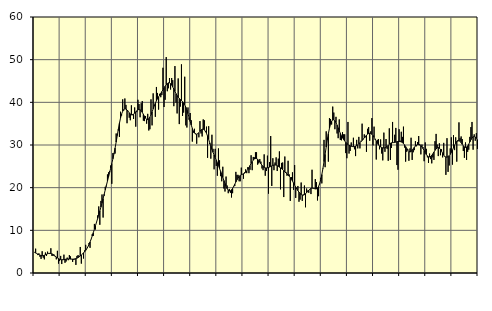
| Category | Piggar | Series 1 |
|---|---|---|
| nan | 4.8 | 4.87 |
| 87.0 | 5.7 | 4.69 |
| 87.0 | 4.6 | 4.56 |
| 87.0 | 4.2 | 4.43 |
| 87.0 | 4.6 | 4.31 |
| 87.0 | 3.8 | 4.19 |
| 87.0 | 3.3 | 4.1 |
| 87.0 | 5.1 | 4.07 |
| 87.0 | 3.6 | 4.08 |
| 87.0 | 3.2 | 4.16 |
| 87.0 | 4.8 | 4.27 |
| 87.0 | 4 | 4.39 |
| nan | 5 | 4.5 |
| 88.0 | 4.6 | 4.58 |
| 88.0 | 4.5 | 4.61 |
| 88.0 | 5.8 | 4.58 |
| 88.0 | 4 | 4.49 |
| 88.0 | 4 | 4.34 |
| 88.0 | 4.3 | 4.15 |
| 88.0 | 3.8 | 3.95 |
| 88.0 | 3.2 | 3.74 |
| 88.0 | 5.2 | 3.54 |
| 88.0 | 2.2 | 3.37 |
| 88.0 | 2.8 | 3.24 |
| nan | 4 | 3.15 |
| 89.0 | 2.1 | 3.11 |
| 89.0 | 3.2 | 3.1 |
| 89.0 | 4.3 | 3.14 |
| 89.0 | 2.4 | 3.19 |
| 89.0 | 2.7 | 3.25 |
| 89.0 | 3.6 | 3.29 |
| 89.0 | 3 | 3.3 |
| 89.0 | 4.2 | 3.29 |
| 89.0 | 3.9 | 3.26 |
| 89.0 | 3.3 | 3.25 |
| 89.0 | 2.6 | 3.25 |
| nan | 3.1 | 3.27 |
| 90.0 | 3.2 | 3.31 |
| 90.0 | 1.9 | 3.38 |
| 90.0 | 4 | 3.48 |
| 90.0 | 4.2 | 3.61 |
| 90.0 | 4 | 3.78 |
| 90.0 | 6.1 | 3.99 |
| 90.0 | 2.2 | 4.22 |
| 90.0 | 4.5 | 4.45 |
| 90.0 | 3.4 | 4.7 |
| 90.0 | 5.3 | 4.98 |
| 90.0 | 6.6 | 5.3 |
| nan | 5.7 | 5.67 |
| 91.0 | 6.1 | 6.12 |
| 91.0 | 7 | 6.66 |
| 91.0 | 5.9 | 7.26 |
| 91.0 | 7.9 | 7.93 |
| 91.0 | 9.1 | 8.67 |
| 91.0 | 8.7 | 9.45 |
| 91.0 | 11.5 | 10.26 |
| 91.0 | 10.2 | 11.1 |
| 91.0 | 11.9 | 11.94 |
| 91.0 | 13.5 | 12.78 |
| 91.0 | 15.6 | 13.63 |
| nan | 11.3 | 14.51 |
| 92.0 | 16.9 | 15.45 |
| 92.0 | 18.4 | 16.42 |
| 92.0 | 13 | 17.44 |
| 92.0 | 18.1 | 18.47 |
| 92.0 | 20.2 | 19.5 |
| 92.0 | 20.3 | 20.52 |
| 92.0 | 23.1 | 21.53 |
| 92.0 | 23.6 | 22.55 |
| 92.0 | 23.9 | 23.57 |
| 92.0 | 25.2 | 24.59 |
| 92.0 | 20.9 | 25.65 |
| nan | 28.1 | 26.76 |
| 93.0 | 28.1 | 27.96 |
| 93.0 | 28 | 29.27 |
| 93.0 | 32.7 | 30.69 |
| 93.0 | 32.5 | 32.2 |
| 93.0 | 33.4 | 33.71 |
| 93.0 | 31.9 | 35.1 |
| 93.0 | 37.8 | 36.3 |
| 93.0 | 36.9 | 37.25 |
| 93.0 | 40.7 | 37.91 |
| 93.0 | 38.1 | 38.31 |
| 93.0 | 40.9 | 38.48 |
| nan | 39.4 | 38.43 |
| 94.0 | 35.1 | 38.21 |
| 94.0 | 38 | 37.89 |
| 94.0 | 36.4 | 37.55 |
| 94.0 | 35.8 | 37.24 |
| 94.0 | 39.3 | 37.07 |
| 94.0 | 37.2 | 37.06 |
| 94.0 | 36.1 | 37.21 |
| 94.0 | 38.8 | 37.47 |
| 94.0 | 34.3 | 37.77 |
| 94.0 | 37.7 | 38.04 |
| 94.0 | 40.6 | 38.25 |
| nan | 39.6 | 38.32 |
| 95.0 | 36.5 | 38.25 |
| 95.0 | 39.8 | 38.02 |
| 95.0 | 40.3 | 37.65 |
| 95.0 | 35.7 | 37.2 |
| 95.0 | 35.6 | 36.73 |
| 95.0 | 36.8 | 36.3 |
| 95.0 | 35 | 36.02 |
| 95.0 | 37.3 | 35.95 |
| 95.0 | 33.4 | 36.13 |
| 95.0 | 33.7 | 36.54 |
| 95.0 | 40.7 | 37.09 |
| nan | 34.6 | 37.75 |
| 96.0 | 42.1 | 38.47 |
| 96.0 | 39.4 | 39.17 |
| 96.0 | 36.6 | 39.8 |
| 96.0 | 43.6 | 40.36 |
| 96.0 | 42.2 | 40.85 |
| 96.0 | 38.3 | 41.29 |
| 96.0 | 42 | 41.7 |
| 96.0 | 41.2 | 42.09 |
| 96.0 | 41.7 | 42.51 |
| 96.0 | 48.1 | 42.94 |
| 96.0 | 38.9 | 43.37 |
| nan | 40.6 | 43.78 |
| 97.0 | 50.6 | 44.13 |
| 97.0 | 42.6 | 44.39 |
| 97.0 | 43.3 | 44.57 |
| 97.0 | 45.7 | 44.57 |
| 97.0 | 43 | 44.38 |
| 97.0 | 45.7 | 44.05 |
| 97.0 | 45.2 | 43.6 |
| 97.0 | 39.1 | 43.08 |
| 97.0 | 48.5 | 42.55 |
| 97.0 | 39.9 | 42.04 |
| 97.0 | 37.4 | 41.59 |
| nan | 45.6 | 41.23 |
| 98.0 | 34.9 | 40.92 |
| 98.0 | 39 | 40.64 |
| 98.0 | 48.9 | 40.42 |
| 98.0 | 36.8 | 40.17 |
| 98.0 | 37.6 | 39.85 |
| 98.0 | 46 | 39.43 |
| 98.0 | 34.6 | 38.87 |
| 98.0 | 34.1 | 38.17 |
| 98.0 | 38.8 | 37.35 |
| 98.0 | 35.9 | 36.44 |
| 98.0 | 37.5 | 35.53 |
| nan | 35.8 | 34.67 |
| 99.0 | 30.8 | 33.9 |
| 99.0 | 32.9 | 33.28 |
| 99.0 | 33.8 | 32.82 |
| 99.0 | 32.7 | 32.55 |
| 99.0 | 30.3 | 32.51 |
| 99.0 | 32.6 | 32.64 |
| 99.0 | 31.8 | 32.9 |
| 99.0 | 35.6 | 33.22 |
| 99.0 | 32.7 | 33.5 |
| 99.0 | 32 | 33.69 |
| 99.0 | 36 | 33.71 |
| nan | 35.8 | 33.55 |
| 0.0 | 33.1 | 33.23 |
| 0.0 | 34.3 | 32.74 |
| 0.0 | 27 | 32.09 |
| 0.0 | 34.4 | 31.32 |
| 0.0 | 30.2 | 30.52 |
| 0.0 | 26.8 | 29.73 |
| 0.0 | 32.4 | 28.98 |
| 0.0 | 29.1 | 28.3 |
| 0.0 | 24.3 | 27.67 |
| 0.0 | 29.1 | 27.06 |
| 0.0 | 25.1 | 26.47 |
| nan | 22.8 | 25.84 |
| 1.0 | 29.2 | 25.18 |
| 1.0 | 26.4 | 24.5 |
| 1.0 | 22.7 | 23.82 |
| 1.0 | 21.5 | 23.13 |
| 1.0 | 24.9 | 22.41 |
| 1.0 | 19.8 | 21.68 |
| 1.0 | 19.1 | 20.97 |
| 1.0 | 22.6 | 20.3 |
| 1.0 | 20.5 | 19.76 |
| 1.0 | 18.7 | 19.41 |
| 1.0 | 19.7 | 19.24 |
| nan | 18.8 | 19.28 |
| 2.0 | 17.7 | 19.49 |
| 2.0 | 18.7 | 19.83 |
| 2.0 | 20.4 | 20.28 |
| 2.0 | 20.4 | 20.79 |
| 2.0 | 23.7 | 21.33 |
| 2.0 | 23 | 21.83 |
| 2.0 | 23 | 22.27 |
| 2.0 | 21.5 | 22.62 |
| 2.0 | 21.5 | 22.87 |
| 2.0 | 24.7 | 23.03 |
| 2.0 | 23.2 | 23.15 |
| nan | 22.1 | 23.26 |
| 3.0 | 23.6 | 23.39 |
| 3.0 | 24.3 | 23.6 |
| 3.0 | 23.4 | 23.91 |
| 3.0 | 24.8 | 24.29 |
| 3.0 | 23.4 | 24.73 |
| 3.0 | 24.2 | 25.19 |
| 3.0 | 27.6 | 25.67 |
| 3.0 | 24.1 | 26.11 |
| 3.0 | 27.2 | 26.47 |
| 3.0 | 27.1 | 26.72 |
| 3.0 | 28.3 | 26.82 |
| nan | 28.3 | 26.81 |
| 4.0 | 25.4 | 26.67 |
| 4.0 | 25.7 | 26.38 |
| 4.0 | 26.7 | 26.01 |
| 4.0 | 26.1 | 25.61 |
| 4.0 | 24.5 | 25.24 |
| 4.0 | 24.1 | 24.94 |
| 4.0 | 27.8 | 24.74 |
| 4.0 | 22.8 | 24.64 |
| 4.0 | 23.9 | 24.62 |
| 4.0 | 27.5 | 24.65 |
| 4.0 | 18.6 | 24.73 |
| nan | 26 | 24.83 |
| 5.0 | 32.1 | 24.95 |
| 5.0 | 20.4 | 25.1 |
| 5.0 | 26.9 | 25.23 |
| 5.0 | 24.1 | 25.31 |
| 5.0 | 25.9 | 25.33 |
| 5.0 | 27.1 | 25.28 |
| 5.0 | 23.9 | 25.14 |
| 5.0 | 26.8 | 24.98 |
| 5.0 | 28.5 | 24.81 |
| 5.0 | 19.6 | 24.63 |
| 5.0 | 25.8 | 24.45 |
| nan | 25.9 | 24.24 |
| 6.0 | 17.8 | 23.98 |
| 6.0 | 27.3 | 23.7 |
| 6.0 | 23.7 | 23.44 |
| 6.0 | 22.8 | 23.19 |
| 6.0 | 26.3 | 22.95 |
| 6.0 | 23.1 | 22.69 |
| 6.0 | 16.9 | 22.37 |
| 6.0 | 22.5 | 22 |
| 6.0 | 23.6 | 21.55 |
| 6.0 | 19.5 | 21.08 |
| 6.0 | 25.3 | 20.61 |
| nan | 17.6 | 20.14 |
| 7.0 | 19.8 | 19.7 |
| 7.0 | 20.4 | 19.3 |
| 7.0 | 16.7 | 18.95 |
| 7.0 | 17.2 | 18.64 |
| 7.0 | 21.2 | 18.4 |
| 7.0 | 16.9 | 18.26 |
| 7.0 | 18.4 | 18.25 |
| 7.0 | 20.5 | 18.36 |
| 7.0 | 15.4 | 18.56 |
| 7.0 | 19.8 | 18.83 |
| 7.0 | 19.3 | 19.13 |
| nan | 18.8 | 19.42 |
| 8.0 | 19.6 | 19.66 |
| 8.0 | 18.5 | 19.83 |
| 8.0 | 24.2 | 19.89 |
| 8.0 | 19.8 | 19.86 |
| 8.0 | 19.7 | 19.78 |
| 8.0 | 22 | 19.7 |
| 8.0 | 21.3 | 19.72 |
| 8.0 | 17 | 19.9 |
| 8.0 | 18 | 20.29 |
| 8.0 | 20.8 | 20.96 |
| 8.0 | 22.3 | 21.89 |
| nan | 21 | 23.07 |
| 9.0 | 24.6 | 24.49 |
| 9.0 | 31.2 | 26.1 |
| 9.0 | 24.8 | 27.8 |
| 9.0 | 33.2 | 29.53 |
| 9.0 | 31.7 | 31.18 |
| 9.0 | 26.1 | 32.67 |
| 9.0 | 36.3 | 33.92 |
| 9.0 | 36.1 | 34.89 |
| 9.0 | 34.8 | 35.55 |
| 9.0 | 39 | 35.88 |
| 9.0 | 37.6 | 35.91 |
| nan | 33.7 | 35.69 |
| 10.0 | 36.6 | 35.26 |
| 10.0 | 32.7 | 34.68 |
| 10.0 | 31.6 | 34.01 |
| 10.0 | 36 | 33.35 |
| 10.0 | 31.2 | 32.73 |
| 10.0 | 31.1 | 32.17 |
| 10.0 | 33 | 31.69 |
| 10.0 | 32.5 | 31.29 |
| 10.0 | 32.5 | 30.94 |
| 10.0 | 28.1 | 30.64 |
| 10.0 | 26.9 | 30.36 |
| nan | 35.4 | 30.12 |
| 11.0 | 28 | 29.94 |
| 11.0 | 28.6 | 29.8 |
| 11.0 | 30.6 | 29.7 |
| 11.0 | 29.7 | 29.64 |
| 11.0 | 31.7 | 29.61 |
| 11.0 | 29 | 29.64 |
| 11.0 | 27.4 | 29.74 |
| 11.0 | 31.2 | 29.86 |
| 11.0 | 29.2 | 30.03 |
| 11.0 | 31.9 | 30.26 |
| 11.0 | 29.2 | 30.51 |
| nan | 31 | 30.79 |
| 12.0 | 35 | 31.06 |
| 12.0 | 31.3 | 31.37 |
| 12.0 | 32.5 | 31.69 |
| 12.0 | 31.8 | 32.02 |
| 12.0 | 28.4 | 32.31 |
| 12.0 | 33.8 | 32.54 |
| 12.0 | 34.2 | 32.69 |
| 12.0 | 31 | 32.75 |
| 12.0 | 33.2 | 32.7 |
| 12.0 | 36.3 | 32.52 |
| 12.0 | 29.9 | 32.23 |
| nan | 34.3 | 31.85 |
| 13.0 | 31.2 | 31.39 |
| 13.0 | 26.6 | 30.9 |
| 13.0 | 31.2 | 30.42 |
| 13.0 | 31.4 | 30.03 |
| 13.0 | 29 | 29.74 |
| 13.0 | 31.3 | 29.54 |
| 13.0 | 28 | 29.41 |
| 13.0 | 26.4 | 29.33 |
| 13.0 | 32.9 | 29.3 |
| 13.0 | 28.4 | 29.33 |
| 13.0 | 31.4 | 29.46 |
| nan | 29.1 | 29.68 |
| 14.0 | 26.3 | 29.94 |
| 14.0 | 33.9 | 30.19 |
| 14.0 | 26.5 | 30.39 |
| 14.0 | 29.3 | 30.51 |
| 14.0 | 35.4 | 30.55 |
| 14.0 | 30.6 | 30.57 |
| 14.0 | 32.4 | 30.61 |
| 14.0 | 34 | 30.68 |
| 14.0 | 25.3 | 30.76 |
| 14.0 | 24.2 | 30.82 |
| 14.0 | 33.7 | 30.84 |
| nan | 31 | 30.8 |
| 15.0 | 33.1 | 30.72 |
| 15.0 | 31.9 | 30.57 |
| 15.0 | 34.3 | 30.34 |
| 15.0 | 29.4 | 30.03 |
| 15.0 | 26.1 | 29.64 |
| 15.0 | 28.4 | 29.2 |
| 15.0 | 29 | 28.78 |
| 15.0 | 26.3 | 28.47 |
| 15.0 | 29.2 | 28.36 |
| 15.0 | 31.7 | 28.46 |
| 15.0 | 26.5 | 28.75 |
| nan | 28.3 | 29.11 |
| 16.0 | 28.8 | 29.47 |
| 16.0 | 30.9 | 29.77 |
| 16.0 | 29.7 | 29.97 |
| 16.0 | 30.7 | 30.07 |
| 16.0 | 32.1 | 30.07 |
| 16.0 | 30.2 | 29.98 |
| 16.0 | 27.8 | 29.8 |
| 16.0 | 30.1 | 29.52 |
| 16.0 | 29.5 | 29.15 |
| 16.0 | 26.2 | 28.7 |
| 16.0 | 30.6 | 28.21 |
| nan | 29.1 | 27.77 |
| 17.0 | 27.1 | 27.43 |
| 17.0 | 25.8 | 27.24 |
| 17.0 | 28 | 27.21 |
| 17.0 | 26.7 | 27.33 |
| 17.0 | 25.7 | 27.58 |
| 17.0 | 27.1 | 27.92 |
| 17.0 | 26.5 | 28.34 |
| 17.0 | 30.9 | 28.75 |
| 17.0 | 32.6 | 29.09 |
| 17.0 | 30.1 | 29.33 |
| 17.0 | 27.4 | 29.41 |
| nan | 30.4 | 29.27 |
| 18.0 | 27.6 | 28.97 |
| 18.0 | 29 | 28.54 |
| 18.0 | 27.1 | 28.08 |
| 18.0 | 30.5 | 27.63 |
| 18.0 | 27.2 | 27.31 |
| 18.0 | 23 | 27.15 |
| 18.0 | 31.6 | 27.15 |
| 18.0 | 23.7 | 27.27 |
| 18.0 | 25.2 | 27.5 |
| 18.0 | 29.2 | 27.82 |
| 18.0 | 31.8 | 28.25 |
| nan | 25.4 | 28.78 |
| 19.0 | 32.3 | 29.36 |
| 19.0 | 28.8 | 29.94 |
| 19.0 | 31.8 | 30.46 |
| 19.0 | 26.1 | 30.85 |
| 19.0 | 30.8 | 31.06 |
| 19.0 | 35.3 | 31.07 |
| 19.0 | 31.6 | 30.87 |
| 19.0 | 32 | 30.54 |
| 19.0 | 31.4 | 30.16 |
| 19.0 | 28.6 | 29.81 |
| 19.0 | 27 | 29.54 |
| nan | 30.6 | 29.43 |
| 20.0 | 26.5 | 29.51 |
| 20.0 | 28.4 | 29.78 |
| 20.0 | 28.9 | 30.2 |
| 20.0 | 31.9 | 30.71 |
| 20.0 | 34.2 | 31.23 |
| 20.0 | 35.4 | 31.66 |
| 20.0 | 28.9 | 31.92 |
| 20.0 | 32.5 | 31.99 |
| 20.0 | 31 | 31.89 |
| 20.0 | 32.8 | 31.62 |
| 20.0 | 29.1 | 31.26 |